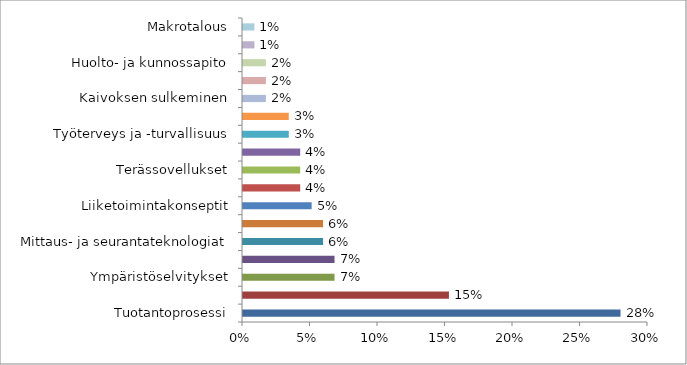
| Category | Series 0 |
|---|---|
| Tuotantoprosessi | 0.28 |
| Jäte- ja sivuvirtojen hallinta | 0.153 |
| Ympäristöselvitykset | 0.068 |
| Moniulotteinen tutkimus | 0.068 |
| Mittaus- ja seurantateknologiat | 0.059 |
| Paikallissuhteet ja muut elinkeinot | 0.059 |
| Liiketoimintakonseptit | 0.051 |
| Malminetsinnän teknologiat | 0.042 |
| Terässovellukset | 0.042 |
| Vaikutusarviointi | 0.042 |
| Työterveys ja -turvallisuus | 0.034 |
| Jäte- ja sivuvirtojen hyötykäyttö | 0.034 |
| Kaivoksen sulkeminen | 0.017 |
| Energia | 0.017 |
| Huolto- ja kunnossapito | 0.017 |
| Viestintä | 0.008 |
| Makrotalous | 0.008 |